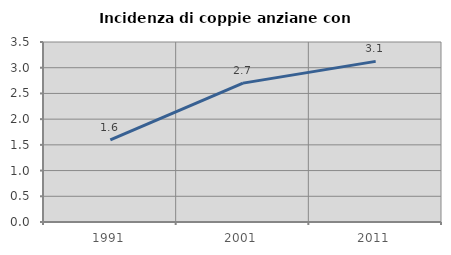
| Category | Incidenza di coppie anziane con figli |
|---|---|
| 1991.0 | 1.597 |
| 2001.0 | 2.701 |
| 2011.0 | 3.123 |